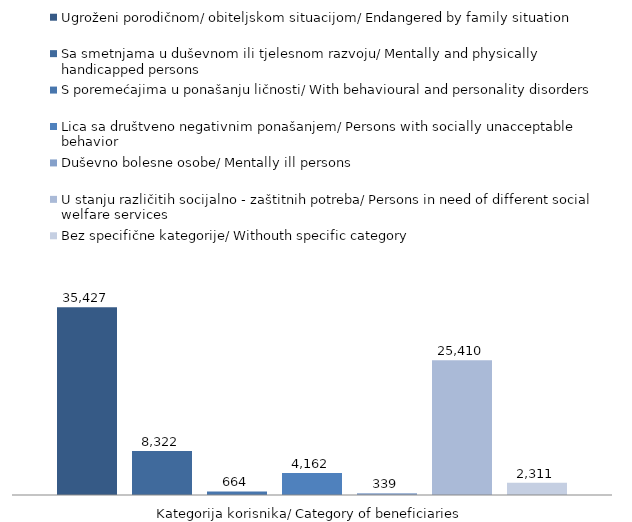
| Category | Ugroženi porodičnom/ obiteljskom situacijom/ Endangered by family situation | Sa smetnjama u duševnom ili tjelesnom razvoju/ Mentally and physically handicapped persons | S poremećajima u ponašanju ličnosti/ With behavioural and personality disorders | Lica sa društveno negativnim ponašanjem/ Persons with socially unacceptable behavior | Duševno bolesne osobe/ Mentally ill persons | U stanju različitih socijalno - zaštitnih potreba/ Persons in need of different social welfare services | Bez specifične kategorije/ Withouth specific category |
|---|---|---|---|---|---|---|---|
| 0 | 35427 | 8322 | 664 | 4162 | 339 | 25410 | 2311 |